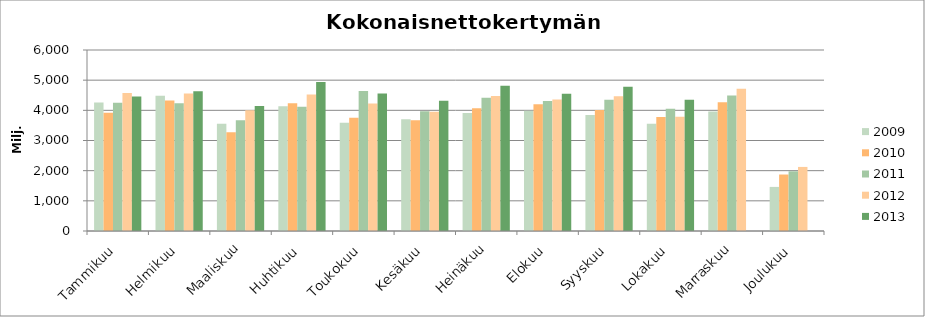
| Category | 2009 | 2010 | 2011 | 2012 | 2013 |
|---|---|---|---|---|---|
| Tammikuu | 4262.104 | 3920.596 | 4254.457 | 4574.273 | 4458.574 |
| Helmikuu | 4482.61 | 4324.273 | 4236.531 | 4556.683 | 4631.184 |
| Maaliskuu | 3551.222 | 3273.1 | 3667.911 | 4003.705 | 4141.995 |
| Huhtikuu | 4137.11 | 4235.283 | 4118.677 | 4521.853 | 4938.018 |
| Toukokuu | 3589.232 | 3758.246 | 4645.002 | 4229.781 | 4554.199 |
| Kesäkuu | 3701.617 | 3667.134 | 3966.073 | 3950.962 | 4320.908 |
| Heinäkuu | 3908.058 | 4070.751 | 4417.867 | 4473.488 | 4813.288 |
| Elokuu | 3983.999 | 4202.024 | 4310.334 | 4361.243 | 4548.338 |
| Syyskuu | 3843.197 | 4009.059 | 4353.55 | 4465.954 | 4780.078 |
| Lokakuu | 3558.554 | 3781.91 | 4052.329 | 3783.435 | 4353.533 |
| Marraskuu | 3964.456 | 4269.91 | 4491.275 | 4716.744 | 0 |
| Joulukuu | 1461.632 | 1872.231 | 1978.993 | 2124.114 | 0 |